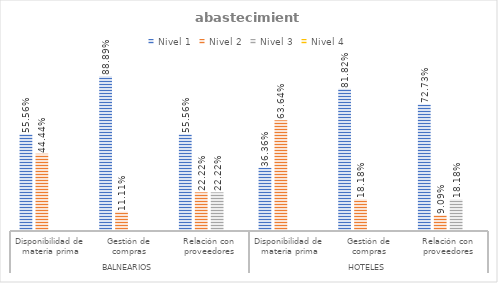
| Category | Nivel 1 | Nivel 2 | Nivel 3 | Nivel 4 |
|---|---|---|---|---|
| 0 | 0.556 | 0.444 | 0 | 0 |
| 1 | 0.889 | 0.111 | 0 | 0 |
| 2 | 0.556 | 0.222 | 0.222 | 0 |
| 3 | 0.364 | 0.636 | 0 | 0 |
| 4 | 0.818 | 0.182 | 0 | 0 |
| 5 | 0.727 | 0.091 | 0.182 | 0 |